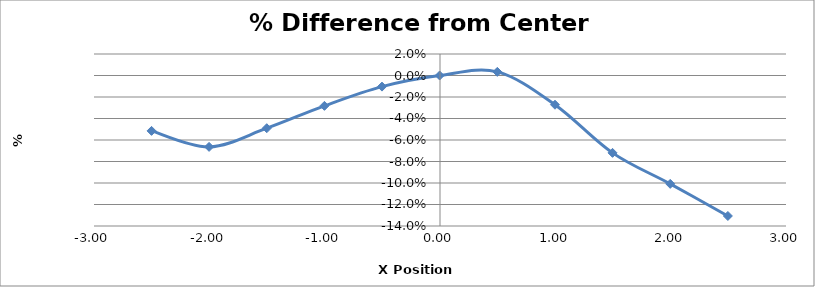
| Category | Series 0 |
|---|---|
| -2.5010000000000003 | -0.052 |
| -2.002 | -0.066 |
| -1.5019999999999998 | -0.049 |
| -1.0019999999999998 | -0.028 |
| -0.5030000000000001 | -0.01 |
| -0.0030000000000001137 | 0 |
| 0.4969999999999999 | 0.003 |
| 0.9969999999999999 | -0.027 |
| 1.4959999999999996 | -0.072 |
| 1.9959999999999996 | -0.101 |
| 2.4959999999999996 | -0.131 |